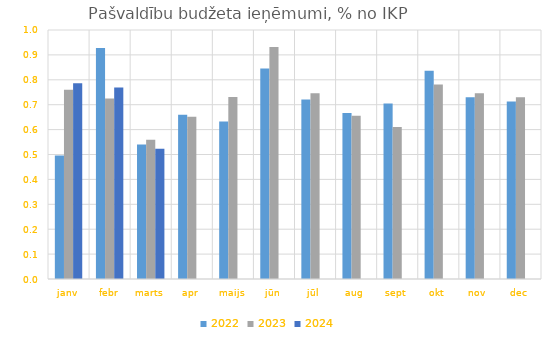
| Category | 2022 | 2023 | 2024 |
|---|---|---|---|
| janv | 0.496 | 0.76 | 0.786 |
| febr | 0.928 | 0.724 | 0.769 |
| marts | 0.54 | 0.559 | 0.523 |
| apr | 0.66 | 0.651 | 0 |
| maijs | 0.633 | 0.731 | 0 |
| jūn | 0.845 | 0.932 | 0 |
| jūl | 0.721 | 0.746 | 0 |
| aug | 0.666 | 0.655 | 0 |
| sept | 0.705 | 0.61 | 0 |
| okt | 0.837 | 0.781 | 0 |
| nov | 0.73 | 0.746 | 0 |
| dec | 0.713 | 0.73 | 0 |